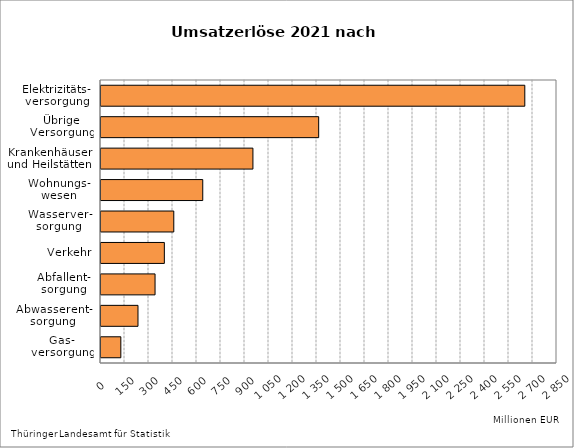
| Category | Series 1 |
|---|---|
| Gas-
versorgung | 123.941 |
| Abwasserent-
sorgung | 231.201 |
| Abfallent-
sorgung | 337.831 |
| Verkehr | 395.901 |
| Wasserver-
sorgung | 454.891 |
| Wohnungs-
wesen | 635.938 |
| Krankenhäuser
und Heilstätten | 949.546 |
| Übrige
Versorgung | 1360.516 |
| Elektrizitäts-
versorgung | 2648.782 |